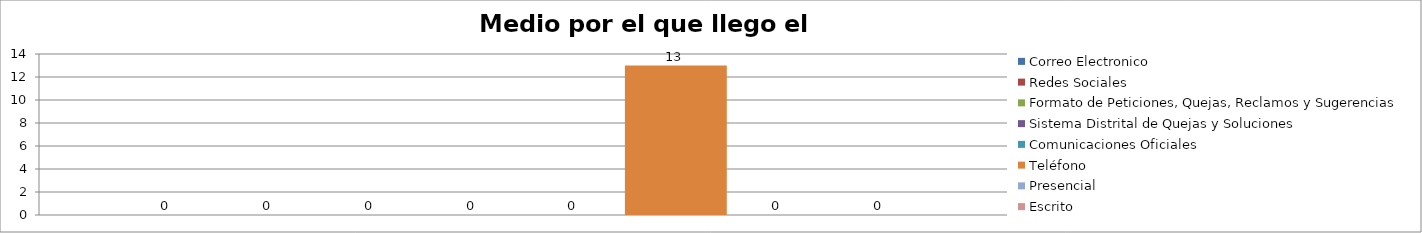
| Category | Correo Electronico | Redes Sociales | Formato de Peticiones, Quejas, Reclamos y Sugerencias | Sistema Distrital de Quejas y Soluciones  | Comunicaciones Oficiales | Teléfono | Presencial | Escrito  |
|---|---|---|---|---|---|---|---|---|
| 0 | 0 | 0 | 0 | 0 | 0 | 13 | 0 | 0 |